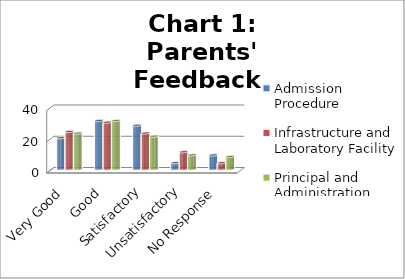
| Category | Admission Procedure | Infrastructure and Laboratory Facility | Principal and Administration |
|---|---|---|---|
| Very Good | 20 | 24 | 23 |
| Good | 31 | 30 | 31 |
| Satisfactory | 28 | 23 | 21 |
| Unsatisfactory | 4 | 11 | 9 |
| No Response | 9 | 4 | 8 |